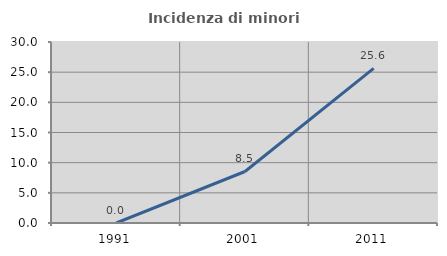
| Category | Incidenza di minori stranieri |
|---|---|
| 1991.0 | 0 |
| 2001.0 | 8.537 |
| 2011.0 | 25.618 |